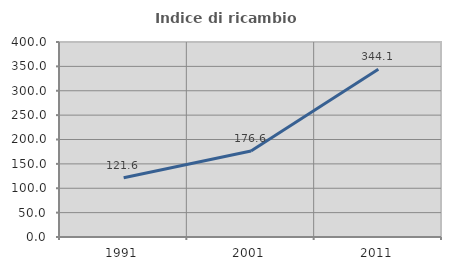
| Category | Indice di ricambio occupazionale  |
|---|---|
| 1991.0 | 121.569 |
| 2001.0 | 176.596 |
| 2011.0 | 344.118 |